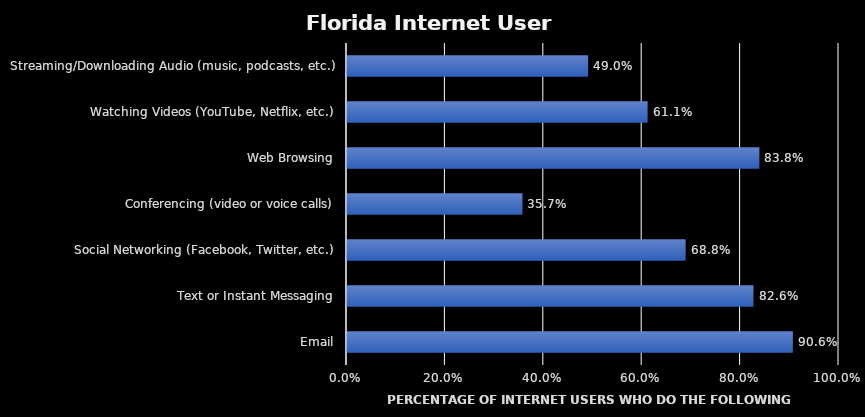
| Category | Series 0 |
|---|---|
| Email | 0.906 |
| Text or Instant Messaging | 0.826 |
| Social Networking (Facebook, Twitter, etc.) | 0.688 |
| Conferencing (video or voice calls) | 0.357 |
| Web Browsing | 0.838 |
| Watching Videos (YouTube, Netflix, etc.) | 0.611 |
| Streaming/Downloading Audio (music, podcasts, etc.) | 0.49 |